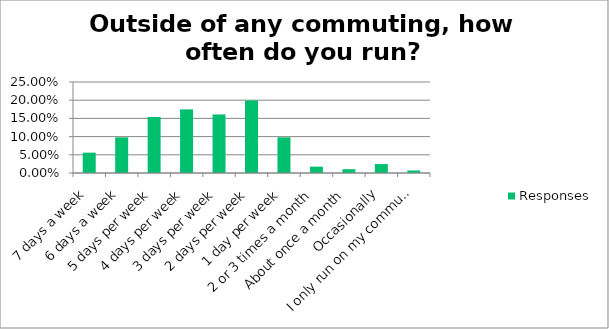
| Category | Responses |
|---|---|
| 7 days a week | 0.056 |
| 6 days a week | 0.098 |
| 5 days per week | 0.154 |
| 4 days per week | 0.175 |
| 3 days per week | 0.161 |
| 2 days per week | 0.199 |
| 1 day per week | 0.098 |
| 2 or 3 times a month | 0.018 |
| About once a month | 0.01 |
| Occasionally | 0.024 |
| I only run on my commute | 0.007 |